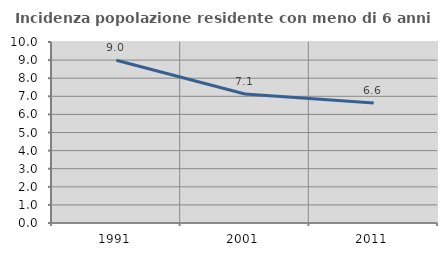
| Category | Incidenza popolazione residente con meno di 6 anni |
|---|---|
| 1991.0 | 8.991 |
| 2001.0 | 7.13 |
| 2011.0 | 6.624 |